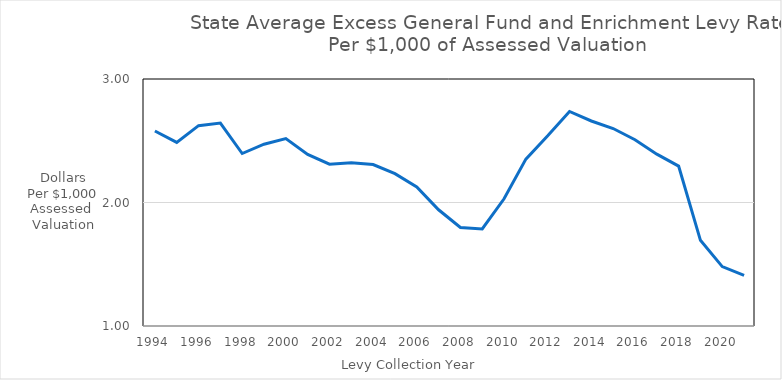
| Category | Series 0 |
|---|---|
| 1994 | 2.579 |
| 1995 | 2.486 |
| 1996 | 2.622 |
| 1997 | 2.643 |
| 1998 | 2.397 |
| 1999 | 2.472 |
| 2000 | 2.518 |
| 2001 | 2.389 |
| 2002 | 2.31 |
| 2003 | 2.322 |
| 2004 | 2.308 |
| 2005 | 2.233 |
| 2006 | 2.126 |
| 2007 | 1.941 |
| 2008 | 1.797 |
| 2009 | 1.786 |
| 2010 | 2.03 |
| 2011 | 2.351 |
| 2012 | 2.54 |
| 2013 | 2.737 |
| 2014 | 2.66 |
| 2015 | 2.599 |
| 2016 | 2.508 |
| 2017 | 2.391 |
| 2018 | 2.295 |
| 2019 | 1.694 |
| 2020 | 1.481 |
| 2021 | 1.409 |